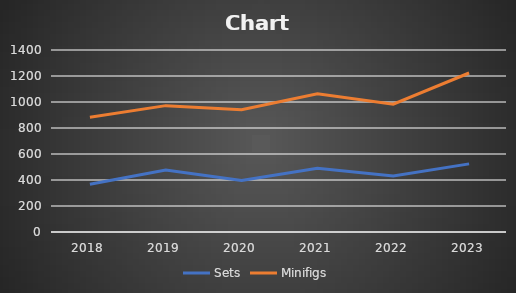
| Category | Sets | Minifigs |
|---|---|---|
| 2018.0 | 368 | 883 |
| 2019.0 | 476 | 972 |
| 2020.0 | 397 | 941 |
| 2021.0 | 490 | 1064 |
| 2022.0 | 431 | 983 |
| 2023.0 | 524 | 1223 |